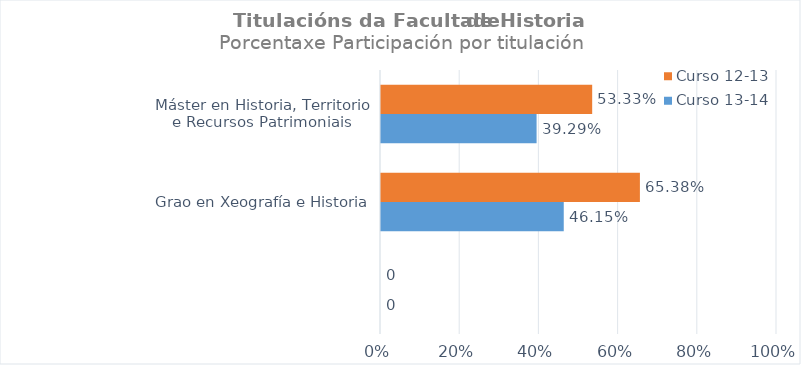
| Category | Curso 13-14 | Curso 12-13 |
|---|---|---|
|  | 0 | 0 |
| Grao en Xeografía e Historia | 0.462 | 0.654 |
| Máster en Historia, Territorio e Recursos Patrimoniais | 0.393 | 0.533 |